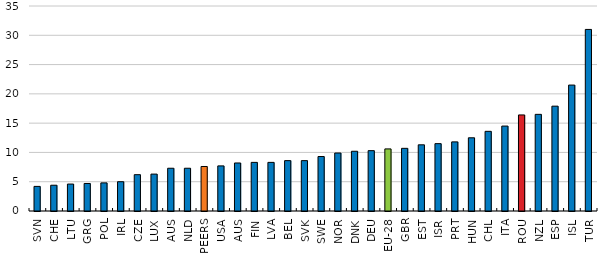
| Category | Series 0 |
|---|---|
| SVN | 4.2 |
| CHE | 4.4 |
| LTU | 4.6 |
| GRG | 4.7 |
| POL | 4.8 |
| IRL | 5 |
| CZE | 6.2 |
| LUX | 6.3 |
| AUS | 7.3 |
| NLD | 7.3 |
| PEERS | 7.6 |
| USA | 7.7 |
| AUS | 8.2 |
| FIN | 8.3 |
| LVA | 8.3 |
| BEL | 8.6 |
| SVK | 8.6 |
| SWE | 9.3 |
| NOR | 9.9 |
| DNK | 10.2 |
| DEU | 10.3 |
| EU-28 | 10.6 |
| GBR | 10.7 |
| EST | 11.3 |
| ISR | 11.5 |
| PRT | 11.8 |
| HUN | 12.5 |
| CHL | 13.6 |
| ITA | 14.5 |
| ROU | 16.4 |
| NZL | 16.5 |
| ESP | 17.9 |
| ISL | 21.5 |
| TUR | 31 |